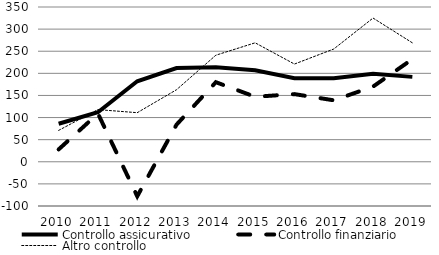
| Category | Controllo assicurativo | Controllo finanziario | Altro controllo |
|---|---|---|---|
| 2010.0 | 86 | 28 | 71 |
| 2011.0 | 112 | 109 | 118 |
| 2012.0 | 182 | -78 | 111 |
| 2013.0 | 212 | 84 | 163 |
| 2014.0 | 214 | 180 | 241 |
| 2015.0 | 207 | 147 | 269 |
| 2016.0 | 189 | 153 | 221 |
| 2017.0 | 189 | 139 | 255 |
| 2018.0 | 199 | 170 | 325 |
| 2019.0 | 192 | 232 | 269 |